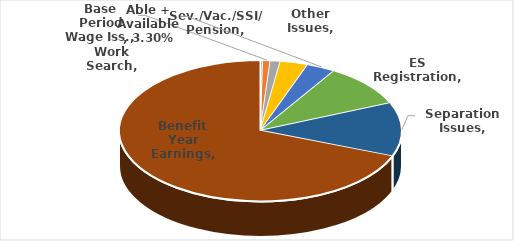
| Category | Series 0 |
|---|---|
| Work Search | 0.003 |
| Base Period Wage Iss. | 0.008 |
| Sev./Vac./SSI/ Pension | 0.011 |
| Other Issues | 0.032 |
| Able + Available | 0.033 |
| ES Registration | 0.098 |
| Separation Issues | 0.123 |
| Benefit Year Earnings | 0.691 |